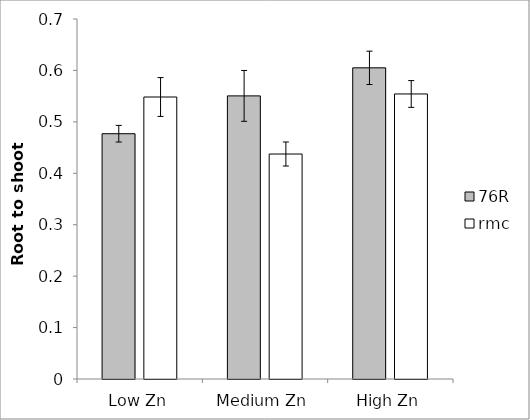
| Category | 76R | rmc |
|---|---|---|
| Low Zn | 0.477 | 0.548 |
| Medium Zn | 0.55 | 0.437 |
| High Zn | 0.605 | 0.554 |